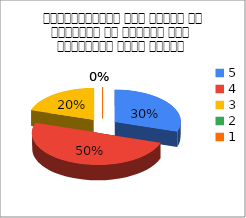
| Category |  महाविद्यालय में कार्य के वातावरण के संदर्भ में संतुष्टि स्तर बताइए |
|---|---|
| 5.0 | 3 |
| 4.0 | 5 |
| 3.0 | 2 |
| 2.0 | 0 |
| 1.0 | 0 |